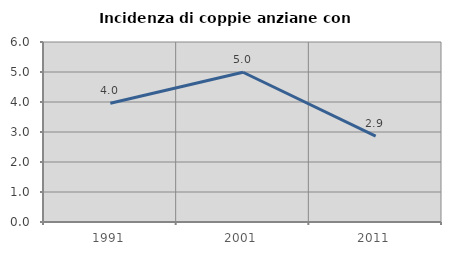
| Category | Incidenza di coppie anziane con figli |
|---|---|
| 1991.0 | 3.96 |
| 2001.0 | 4.992 |
| 2011.0 | 2.862 |